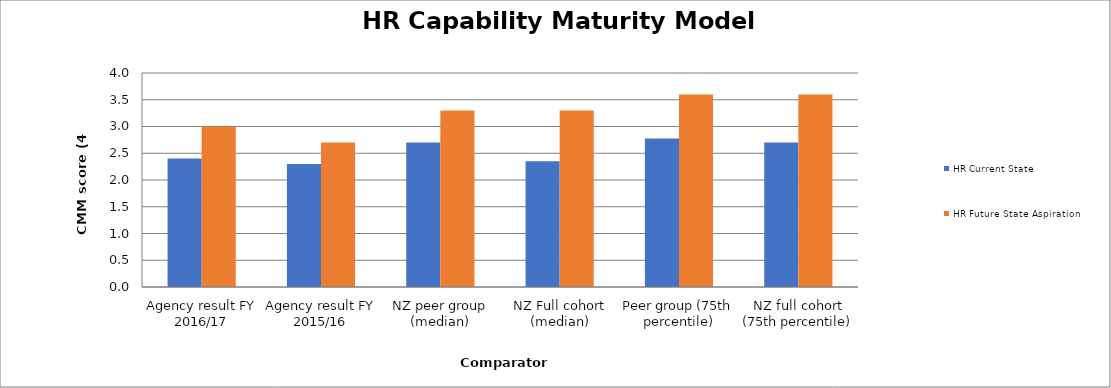
| Category | HR Current State | HR Future State Aspiration |
|---|---|---|
| Agency result FY 2016/17 | 2.4 | 3 |
| Agency result FY 2015/16 | 2.3 | 2.7 |
| NZ peer group (median) | 2.7 | 3.3 |
| NZ Full cohort (median) | 2.35 | 3.3 |
| Peer group (75th percentile) | 2.775 | 3.6 |
| NZ full cohort (75th percentile) | 2.7 | 3.6 |